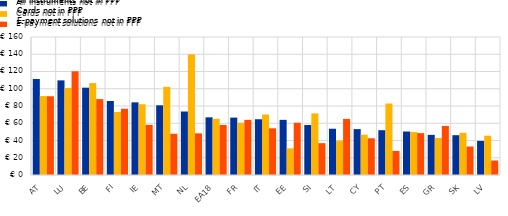
| Category | All instruments not in PPP | Cards not in PPP | E-payment solutions not in PPP |
|---|---|---|---|
| AT | 111.29 | 91.52 | 91.3 |
| LU | 109.72 | 100.95 | 120.25 |
| BE | 101.25 | 106.55 | 88 |
| FI | 85.83 | 73.06 | 76.84 |
| IE | 84.23 | 82.04 | 58.08 |
| MT | 80.82 | 102.15 | 47.82 |
| NL | 73.6 | 139.88 | 48.3 |
| EA18 | 66.86 | 65.13 | 57.943 |
| FR | 66.55 | 60.55 | 63.9 |
| IT | 64.64 | 70.12 | 54.12 |
| EE | 63.93 | 30.94 | 60.58 |
| SI | 58 | 71.43 | 36.91 |
| LT | 53.64 | 39.84 | 65.02 |
| CY | 53.2 | 46.78 | 42.56 |
| PT | 51.96 | 82.88 | 27.88 |
| ES | 50.41 | 49.87 | 48.58 |
| GR | 46.51 | 42.94 | 56.84 |
| SK | 46.16 | 48.98 | 33.04 |
| LV | 39.51 | 45.55 | 16.79 |